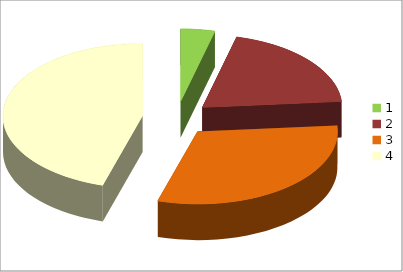
| Category | Series 0 |
|---|---|
| 0 | 6 |
| 1 | 30 |
| 2 | 47 |
| 3 | 69 |